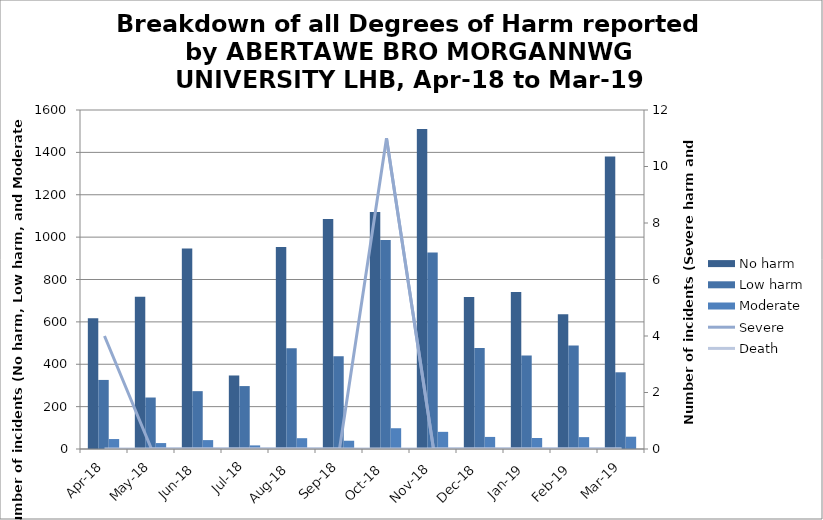
| Category | No harm | Low harm | Moderate |
|---|---|---|---|
| Apr-18 | 617 | 326 | 47 |
| May-18 | 718 | 243 | 28 |
| Jun-18 | 946 | 273 | 42 |
| Jul-18 | 347 | 297 | 17 |
| Aug-18 | 953 | 475 | 51 |
| Sep-18 | 1085 | 438 | 39 |
| Oct-18 | 1119 | 986 | 98 |
| Nov-18 | 1510 | 928 | 81 |
| Dec-18 | 717 | 477 | 57 |
| Jan-19 | 741 | 441 | 52 |
| Feb-19 | 636 | 488 | 56 |
| Mar-19 | 1380 | 362 | 58 |